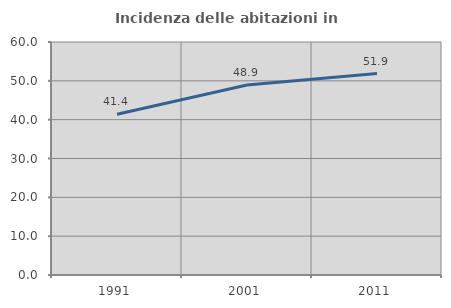
| Category | Incidenza delle abitazioni in proprietà  |
|---|---|
| 1991.0 | 41.406 |
| 2001.0 | 48.909 |
| 2011.0 | 51.88 |